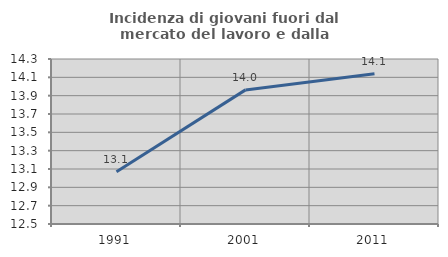
| Category | Incidenza di giovani fuori dal mercato del lavoro e dalla formazione  |
|---|---|
| 1991.0 | 13.071 |
| 2001.0 | 13.963 |
| 2011.0 | 14.14 |